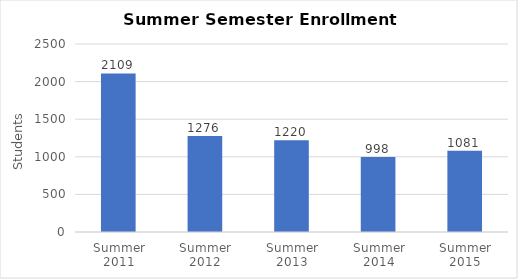
| Category | Series 0 |
|---|---|
| Summer 2011 | 2109 |
| Summer 2012 | 1276 |
| Summer 2013 | 1220 |
| Summer 2014 | 998 |
| Summer 2015 | 1081 |